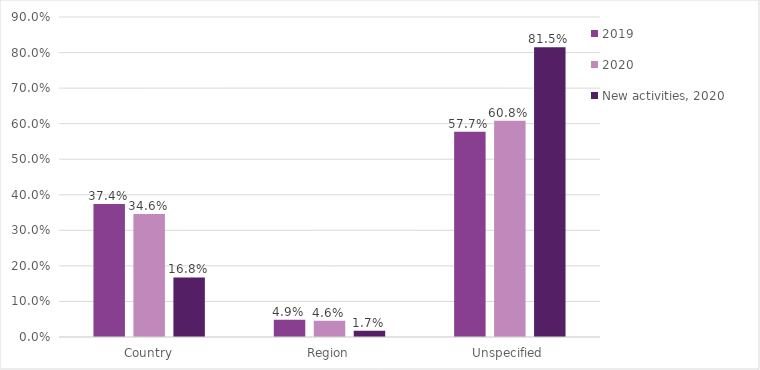
| Category | 2019 | 2020 | New activities, 2020 |
|---|---|---|---|
| Country | 0.374 | 0.346 | 0.168 |
| Region | 0.049 | 0.046 | 0.017 |
| Unspecified | 0.577 | 0.608 | 0.815 |